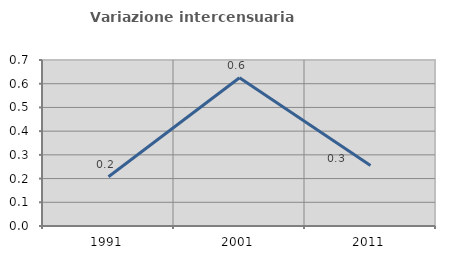
| Category | Variazione intercensuaria annua |
|---|---|
| 1991.0 | 0.208 |
| 2001.0 | 0.625 |
| 2011.0 | 0.255 |